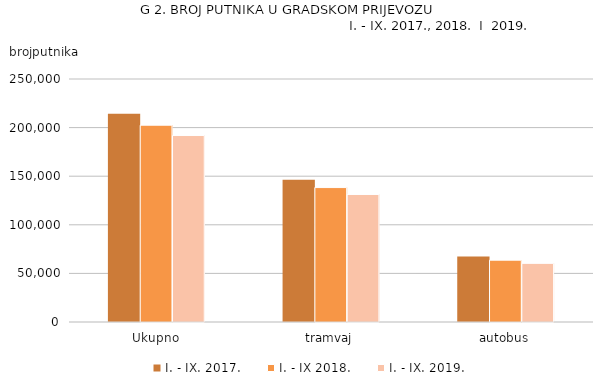
| Category | I. - IX. 2017. | I. - IX 2018. | I. - IX. 2019. |
|---|---|---|---|
| Ukupno | 214318 | 202450 | 191846 |
| tramvaj | 146404 | 138295 | 131179 |
| autobus | 67334 | 63595 | 60326 |